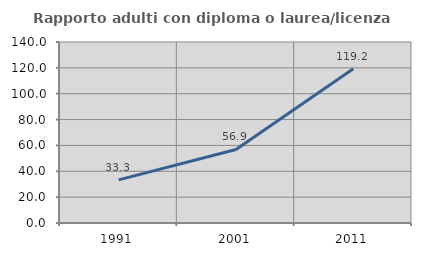
| Category | Rapporto adulti con diploma o laurea/licenza media  |
|---|---|
| 1991.0 | 33.333 |
| 2001.0 | 56.863 |
| 2011.0 | 119.231 |